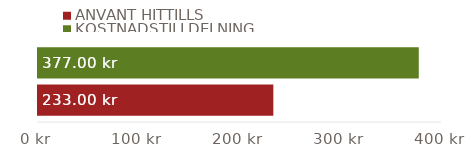
| Category | ANVÄNT HITTILLS | KOSTNADSTILLDELNING |
|---|---|---|
| TOTALSUMMOR | 233 | 377 |